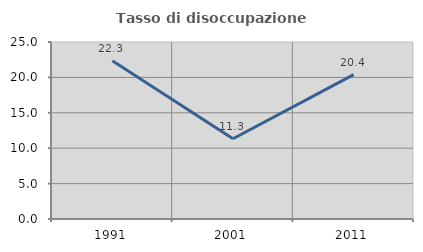
| Category | Tasso di disoccupazione giovanile  |
|---|---|
| 1991.0 | 22.348 |
| 2001.0 | 11.339 |
| 2011.0 | 20.385 |